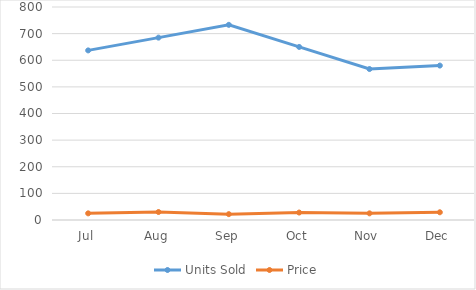
| Category | Units Sold | Price |
|---|---|---|
| Jul | 637 | 25 |
| Aug | 685 | 30 |
| Sep | 733 | 22 |
| Oct | 650 | 28 |
| Nov | 567 | 25 |
| Dec | 580 | 29 |